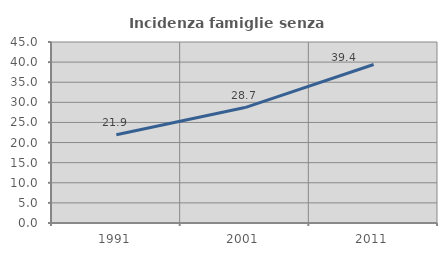
| Category | Incidenza famiglie senza nuclei |
|---|---|
| 1991.0 | 21.941 |
| 2001.0 | 28.694 |
| 2011.0 | 39.4 |